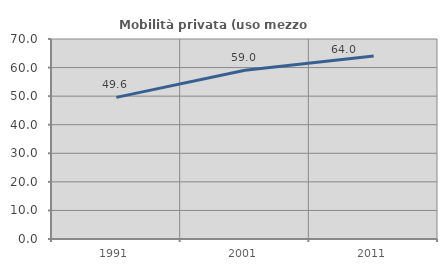
| Category | Mobilità privata (uso mezzo privato) |
|---|---|
| 1991.0 | 49.57 |
| 2001.0 | 59.031 |
| 2011.0 | 64.015 |